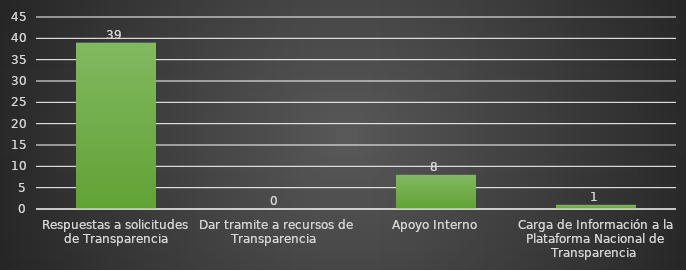
| Category | INDICADOR  |
|---|---|
| Respuestas a solicitudes de Transparencia | 39 |
| Dar tramite a recursos de Transparencia  | 0 |
| Apoyo Interno | 8 |
| Carga de Información a la Plataforma Nacional de Transparencia  | 1 |